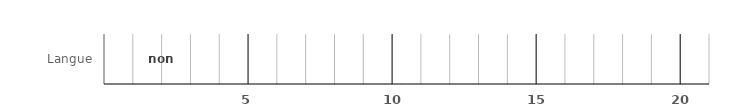
| Category | non recommandé |
|---|---|
| Langue | 0 |